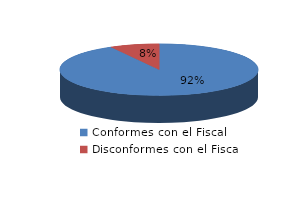
| Category | Series 0 |
|---|---|
| 0 | 1691 |
| 1 | 148 |